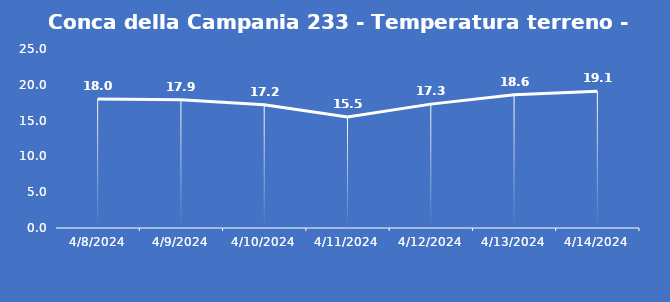
| Category | Conca della Campania 233 - Temperatura terreno - Grezzo (°C) |
|---|---|
| 4/8/24 | 18 |
| 4/9/24 | 17.9 |
| 4/10/24 | 17.2 |
| 4/11/24 | 15.5 |
| 4/12/24 | 17.3 |
| 4/13/24 | 18.6 |
| 4/14/24 | 19.1 |